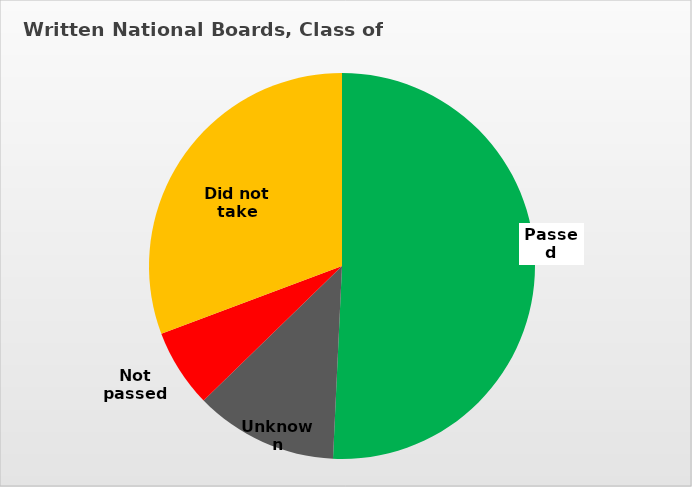
| Category | Series 0 |
|---|---|
| Passed | 0.507 |
| Unknown | 0.12 |
| Not passed | 0.066 |
| Did not take | 0.307 |